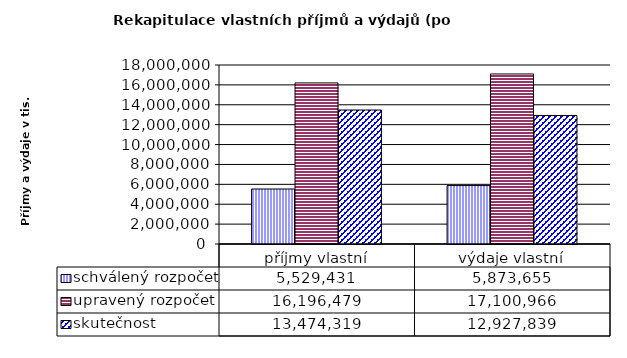
| Category | schválený rozpočet | upravený rozpočet | skutečnost |
|---|---|---|---|
| příjmy vlastní | 5529431 | 16196479 | 13474319 |
| výdaje vlastní | 5873655 | 17100966 | 12927839 |